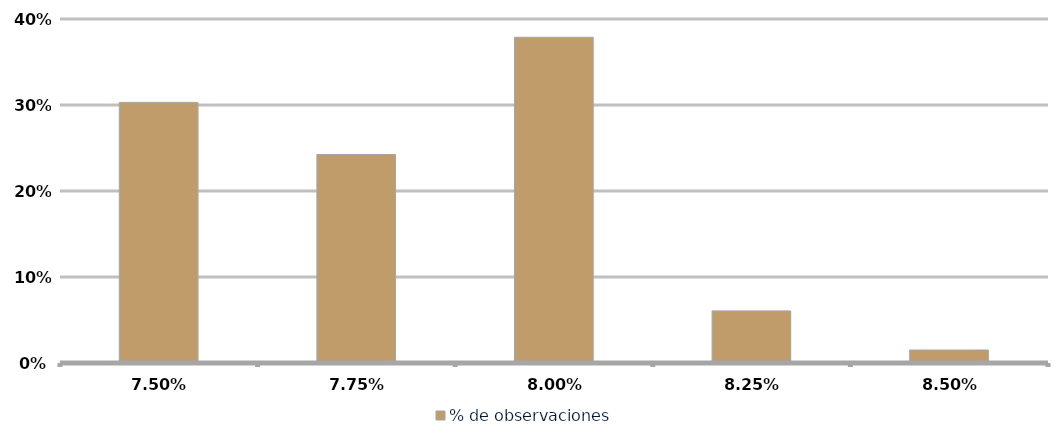
| Category | % de observaciones  |
|---|---|
| 0.075 | 0.303 |
| 0.0775 | 0.242 |
| 0.08 | 0.379 |
| 0.0825 | 0.061 |
| 0.085 | 0.015 |